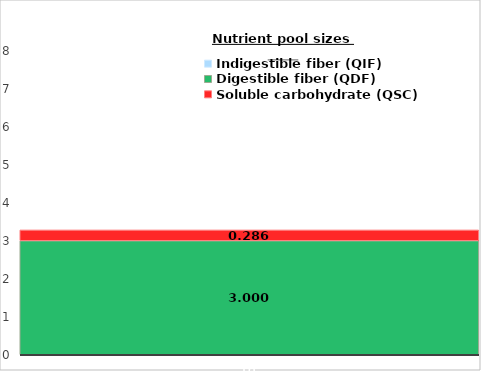
| Category | Indigestible fiber (QIF) | Digestible fiber (QDF) | Soluble carbohydrate (QSC) |
|---|---|---|---|
| 0 |  | 3 | 0.286 |